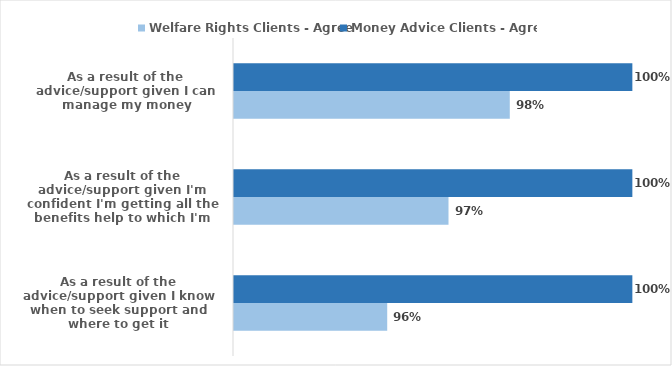
| Category | Welfare Rights Clients - Agree | Money Advice Clients - Agree |
|---|---|---|
| As a result of the advice/support given I know when to seek support and where to get it | 0.96 | 1 |
| As a result of the advice/support given I'm confident I'm getting all the benefits help to which I'm entitled | 0.97 | 1 |
| As a result of the advice/support given I can manage my money | 0.98 | 1 |